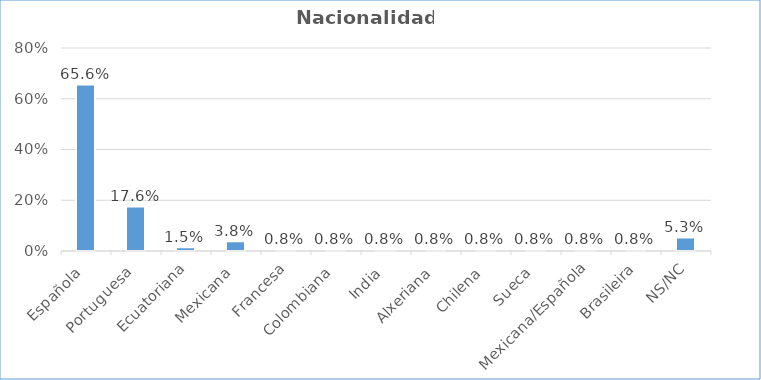
| Category | % das respostas |
|---|---|
| Española | 0.656 |
| Portuguesa | 0.176 |
| Ecuatoriana | 0.015 |
| Mexicana | 0.038 |
| Francesa | 0.008 |
| Colombiana | 0.008 |
| India | 0.008 |
| Alxeriana | 0.008 |
| Chilena | 0.008 |
| Sueca | 0.008 |
| Mexicana/Española | 0.008 |
| Brasileira | 0.008 |
| NS/NC | 0.053 |